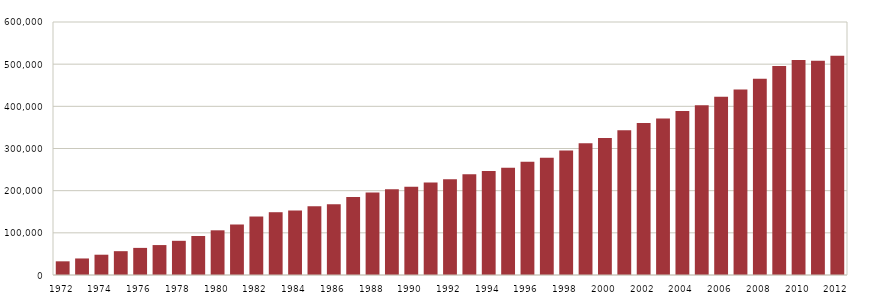
| Category | I alt |
|---|---|
| 1972 | 32430 |
| 1973 | 39218 |
| 1974 | 48114 |
| 1975 | 56501 |
| 1976 | 64286 |
| 1977 | 70997 |
| 1978 | 81082 |
| 1979 | 92559 |
| 1980 | 105986 |
| 1981 | 119776 |
| 1982 | 138696 |
| 1983 | 148904 |
| 1984 | 153042 |
| 1985 | 163322 |
| 1986 | 167800 |
| 1987 | 184913 |
| 1988 | 195502 |
| 1989 | 203324 |
| 1990 | 209480 |
| 1991 | 219643 |
| 1992 | 226854 |
| 1993 | 238765 |
| 1994 | 246731 |
| 1995 | 254423 |
| 1996 | 268710 |
| 1997 | 278107 |
| 1998 | 295246 |
| 1999 | 312370 |
| 2000 | 325099 |
| 2001 | 343260 |
| 2002 | 360212 |
| 2003 | 371236 |
| 2004 | 389028 |
| 2005 | 402509 |
| 2006 | 422605 |
| 2007 | 439979 |
| 2008 | 465404 |
| 2009 | 495915 |
| 2010 | 509779 |
| 2011 | 508122 |
| 2012 | 520110 |